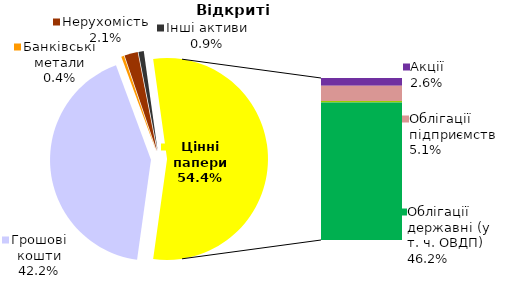
| Category | Відкриті |
|---|---|
| Грошові кошти | 480.56 |
| Банківські метали | 5.006 |
| Нерухомість | 24.427 |
| Інші активи | 9.706 |
| Акції | 29.631 |
| Облігації підприємств | 58.535 |
| Муніципальні облігації | 5.231 |
| Облігації державні (у т. ч. ОВДП) | 526.714 |